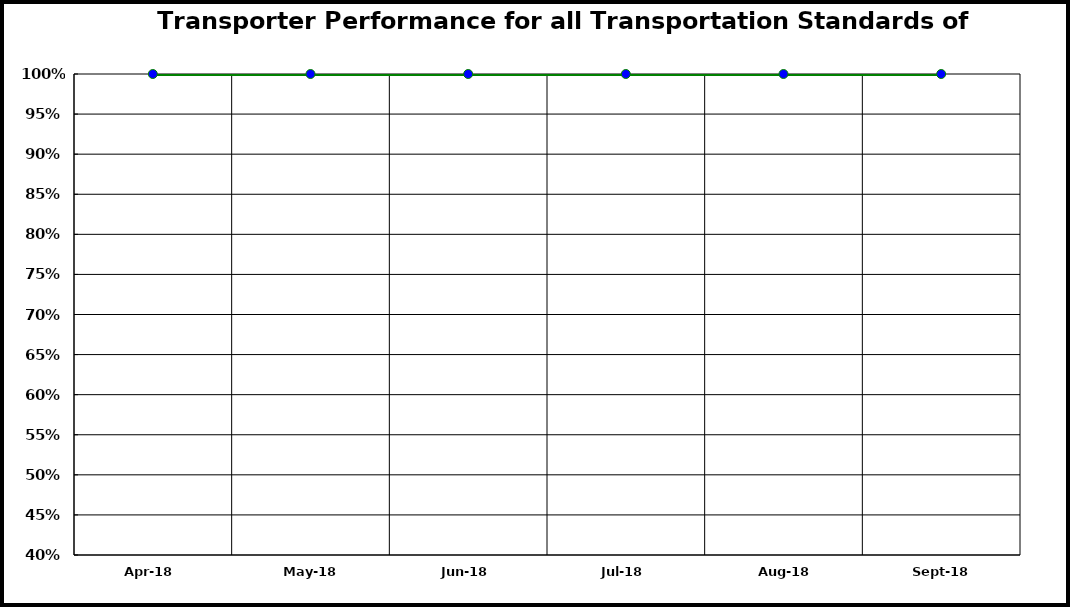
| Category | Performance |
|---|---|
| 2018-04-01 | 1 |
| 2018-05-01 | 1 |
| 2018-06-01 | 1 |
| 2018-07-01 | 1 |
| 2018-08-01 | 1 |
| 2018-09-01 | 1 |